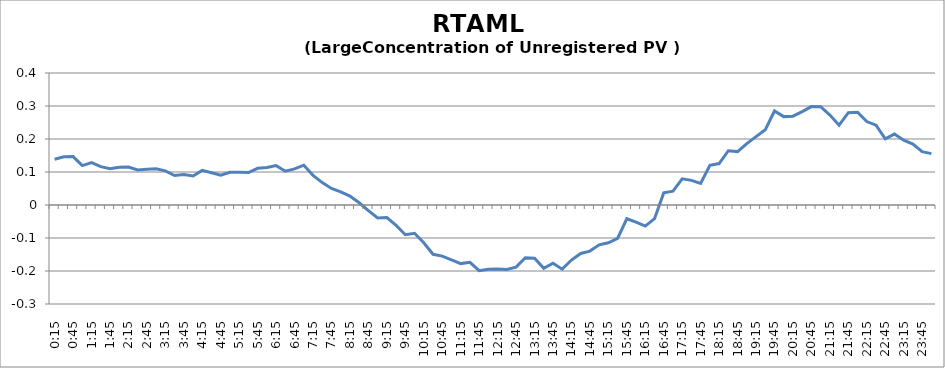
| Category | Series 0 |
|---|---|
| 0:15 | 0.139 |
| 0:30 | 0.146 |
| 0:45 | 0.147 |
| 1:00 | 0.119 |
| 1:15 | 0.128 |
| 1:30 | 0.116 |
| 1:45 | 0.11 |
| 2:00 | 0.115 |
| 2:15 | 0.115 |
| 2:30 | 0.106 |
| 2:45 | 0.108 |
| 3:00 | 0.11 |
| 3:15 | 0.104 |
| 3:30 | 0.089 |
| 3:45 | 0.092 |
| 4:00 | 0.088 |
| 4:15 | 0.105 |
| 4:30 | 0.098 |
| 4:45 | 0.091 |
| 5:00 | 0.099 |
| 5:15 | 0.099 |
| 5:30 | 0.098 |
| 5:45 | 0.111 |
| 6:00 | 0.113 |
| 6:15 | 0.119 |
| 6:30 | 0.103 |
| 6:45 | 0.11 |
| 7:00 | 0.121 |
| 7:15 | 0.09 |
| 7:30 | 0.068 |
| 7:45 | 0.05 |
| 8:00 | 0.04 |
| 8:15 | 0.027 |
| 8:30 | 0.007 |
| 8:45 | -0.017 |
| 9:00 | -0.039 |
| 9:15 | -0.038 |
| 9:30 | -0.062 |
| 9:45 | -0.09 |
| 10:00 | -0.086 |
| 10:15 | -0.114 |
| 10:30 | -0.149 |
| 10:45 | -0.155 |
| 11:00 | -0.167 |
| 11:15 | -0.178 |
| 11:30 | -0.174 |
| 11:45 | -0.199 |
| 12:00 | -0.195 |
| 12:15 | -0.194 |
| 12:30 | -0.195 |
| 12:45 | -0.188 |
| 13:00 | -0.16 |
| 13:15 | -0.161 |
| 13:30 | -0.192 |
| 13:45 | -0.177 |
| 14:00 | -0.194 |
| 14:15 | -0.167 |
| 14:30 | -0.147 |
| 14:45 | -0.14 |
| 15:00 | -0.121 |
| 15:15 | -0.114 |
| 15:30 | -0.101 |
| 15:45 | -0.042 |
| 16:00 | -0.052 |
| 16:15 | -0.064 |
| 16:30 | -0.041 |
| 16:45 | 0.037 |
| 17:00 | 0.042 |
| 17:15 | 0.079 |
| 17:30 | 0.075 |
| 17:45 | 0.065 |
| 18:00 | 0.12 |
| 18:15 | 0.126 |
| 18:30 | 0.164 |
| 18:45 | 0.162 |
| 19:00 | 0.186 |
| 19:15 | 0.207 |
| 19:30 | 0.228 |
| 19:45 | 0.285 |
| 20:00 | 0.268 |
| 20:15 | 0.269 |
| 20:30 | 0.283 |
| 20:45 | 0.298 |
| 21:00 | 0.298 |
| 21:15 | 0.273 |
| 21:30 | 0.242 |
| 21:45 | 0.28 |
| 22:00 | 0.281 |
| 22:15 | 0.253 |
| 22:30 | 0.242 |
| 22:45 | 0.201 |
| 23:00 | 0.215 |
| 23:15 | 0.197 |
| 23:30 | 0.185 |
| 23:45 | 0.162 |
| 24:00 | 0.156 |